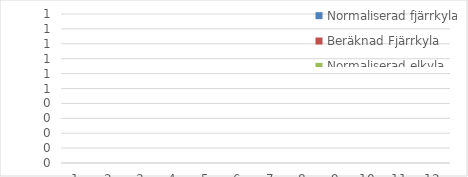
| Category | Normaliserad fjärrkyla | Beräknad Fjärrkyla | Normaliserad elkyla | Beräknad elkyla |
|---|---|---|---|---|
| 0 | 0 |  | 0 |  |
| 1 | 0 |  | 0 |  |
| 2 | 0 |  | 0 |  |
| 3 | 0 |  | 0 |  |
| 4 | 0 |  | 0 |  |
| 5 | 0 |  | 0 |  |
| 6 | 0 |  | 0 |  |
| 7 | 0 |  | 0 |  |
| 8 | 0 |  | 0 |  |
| 9 | 0 |  | 0 |  |
| 10 | 0 |  | 0 |  |
| 11 | 0 |  | 0 |  |